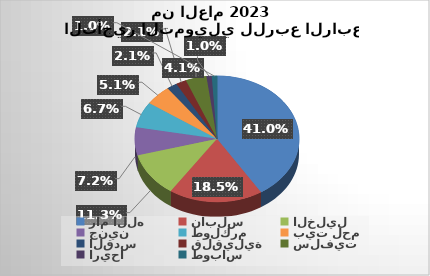
| Category | Series 0 |
|---|---|
| رام الله | 0.41 |
| نابلس | 0.185 |
| الخليل | 0.113 |
| جنين | 0.072 |
| طولكرم | 0.067 |
| بيت لحم  | 0.051 |
| القدس | 0.021 |
| قلقيلية | 0.021 |
| سلفيت | 0.041 |
| اريحا  | 0.01 |
| طوباس | 0.01 |